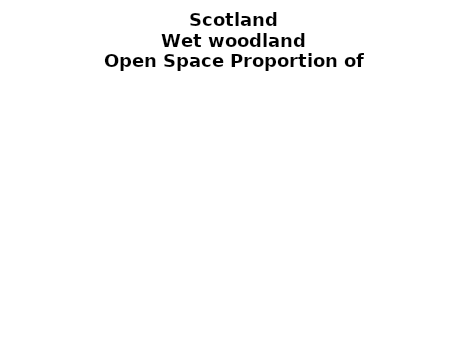
| Category | Wet woodland |
|---|---|
|  ≥ 10ha, < 10%  | 0.172 |
|   ≥ 10ha, 10-25% | 0.133 |
|   ≥ 10ha, > 25 and <50%  | 0.153 |
|   ≥ 10ha, ≥ 50%  | 0.329 |
|  < 10ha, < 10% | 0.012 |
|  < 10ha, 10-25% | 0.043 |
|  < 10ha, > 25 and < 50% | 0.025 |
|  < 10ha, ≥ 50% | 0.134 |